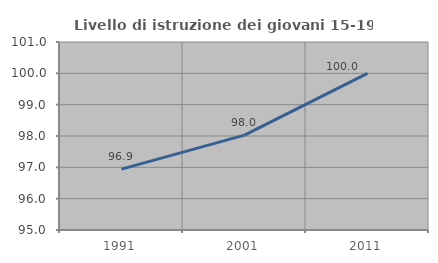
| Category | Livello di istruzione dei giovani 15-19 anni |
|---|---|
| 1991.0 | 96.943 |
| 2001.0 | 98.026 |
| 2011.0 | 100 |